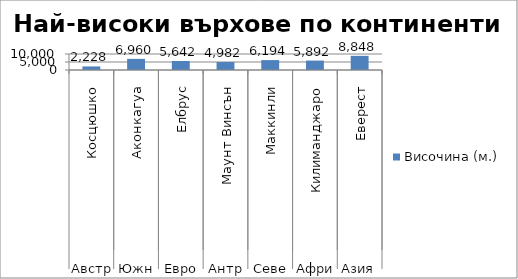
| Category | Височина (м.) |
|---|---|
| 0 | 2228 |
| 1 | 6960 |
| 2 | 5642 |
| 3 | 4982 |
| 4 | 6194 |
| 5 | 5892 |
| 6 | 8848 |